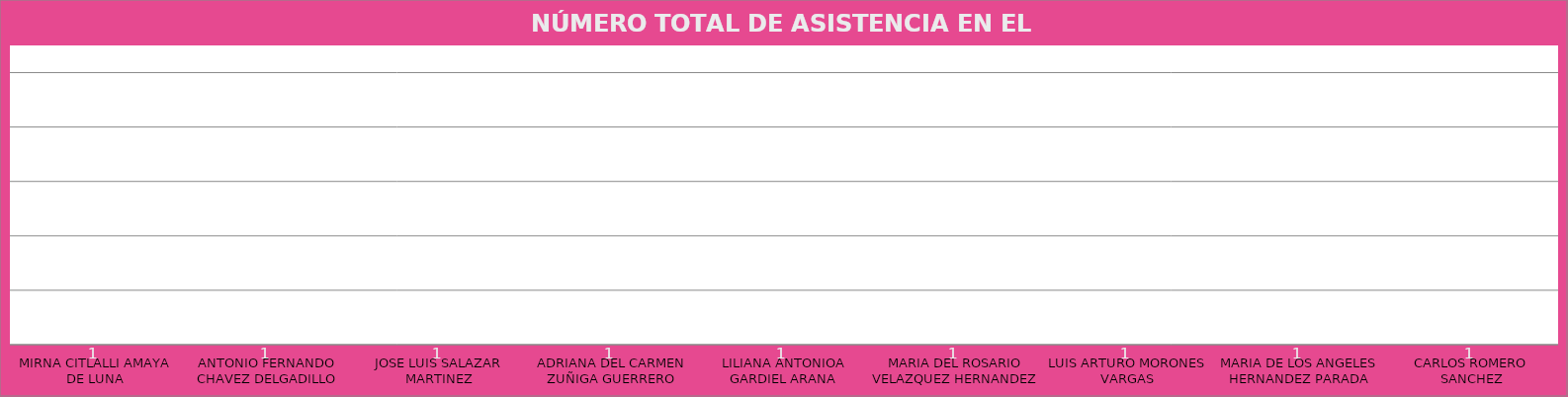
| Category | MIRNA CITLALLI AMAYA DE LUNA |
|---|---|
| MIRNA CITLALLI AMAYA DE LUNA | 1 |
| ANTONIO FERNANDO CHAVEZ DELGADILLO | 1 |
| JOSE LUIS SALAZAR MARTINEZ | 1 |
| ADRIANA DEL CARMEN ZUÑIGA GUERRERO | 1 |
| LILIANA ANTONIOA GARDIEL ARANA | 1 |
| MARIA DEL ROSARIO VELAZQUEZ HERNANDEZ | 1 |
| LUIS ARTURO MORONES VARGAS | 1 |
| MARIA DE LOS ANGELES HERNANDEZ PARADA | 1 |
| CARLOS ROMERO SANCHEZ | 1 |